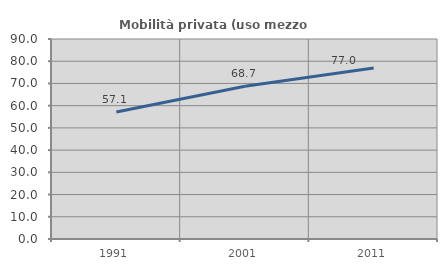
| Category | Mobilità privata (uso mezzo privato) |
|---|---|
| 1991.0 | 57.136 |
| 2001.0 | 68.741 |
| 2011.0 | 76.974 |